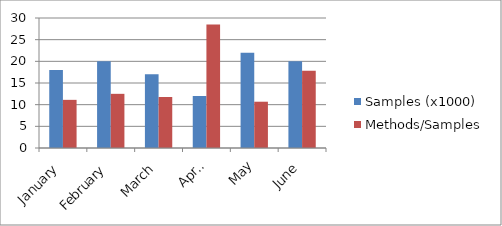
| Category | Samples (x1000) | Methods/Samples |
|---|---|---|
| January | 18 | 11.111 |
| February | 20 | 12.5 |
| March | 17 | 11.765 |
| April | 12 | 28.5 |
| May | 22 | 10.682 |
| June | 20 | 17.8 |